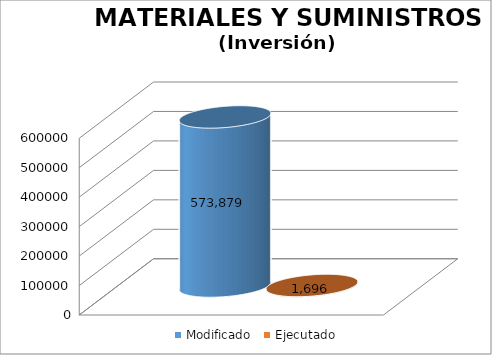
| Category | Modificado | Ejecutado |
|---|---|---|
| 0 | 573879 | 1696.32 |